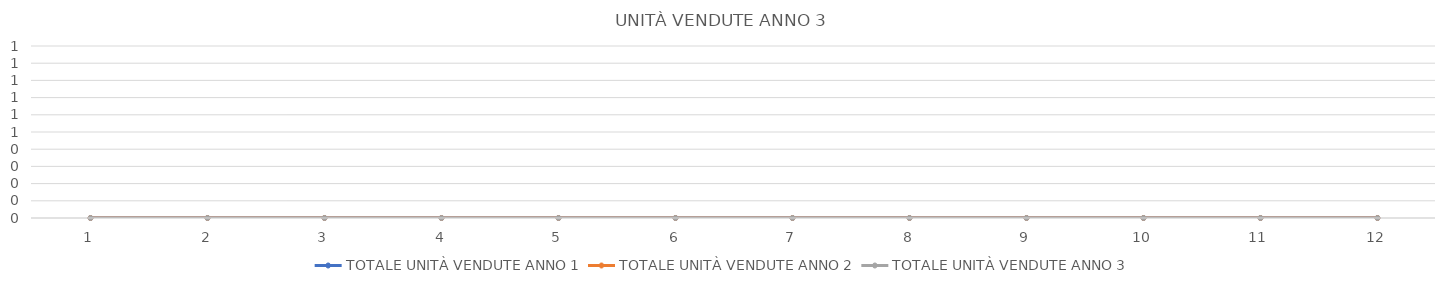
| Category | TOTALE UNITÀ VENDUTE ANNO 1 | TOTALE UNITÀ VENDUTE ANNO 2 | TOTALE UNITÀ VENDUTE ANNO 3 |
|---|---|---|---|
| 0 | 0 | 0 | 0 |
| 1 | 0 | 0 | 0 |
| 2 | 0 | 0 | 0 |
| 3 | 0 | 0 | 0 |
| 4 | 0 | 0 | 0 |
| 5 | 0 | 0 | 0 |
| 6 | 0 | 0 | 0 |
| 7 | 0 | 0 | 0 |
| 8 | 0 | 0 | 0 |
| 9 | 0 | 0 | 0 |
| 10 | 0 | 0 | 0 |
| 11 | 0 | 0 | 0 |